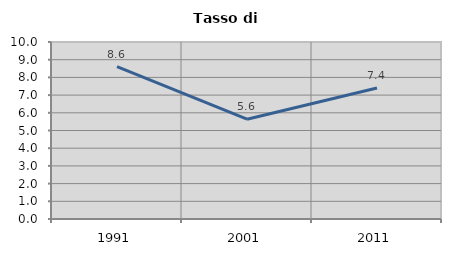
| Category | Tasso di disoccupazione   |
|---|---|
| 1991.0 | 8.612 |
| 2001.0 | 5.64 |
| 2011.0 | 7.405 |